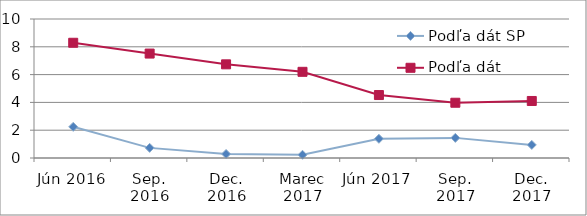
| Category | Podľa dát SP | Podľa dát ÚPSVaR |
|---|---|---|
| Jún 2016 | 2.243 | 8.29 |
| Sep. 2016 | 0.729 | 7.513 |
| Dec. 2016 | 0.289 | 6.739 |
| Marec 2017 | 0.233 | 6.2 |
| Jún 2017 | 1.382 | 4.53 |
| Sep. 2017 | 1.448 | 3.975 |
| Dec. 2017 | 0.941 | 4.102 |